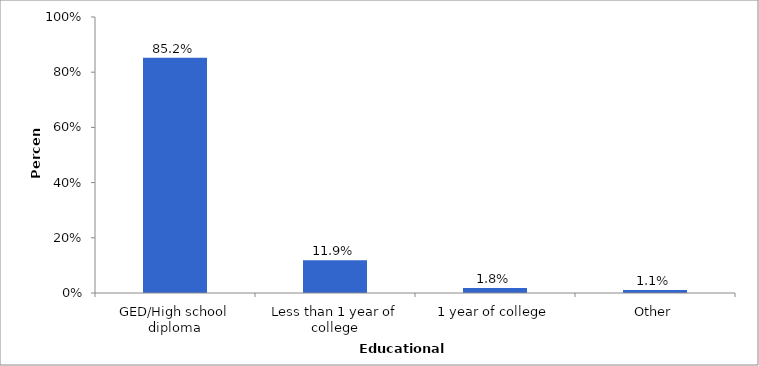
| Category | Series 0 |
|---|---|
| GED/High school diploma | 0.852 |
| Less than 1 year of college | 0.119 |
| 1 year of college | 0.018 |
| Other | 0.011 |